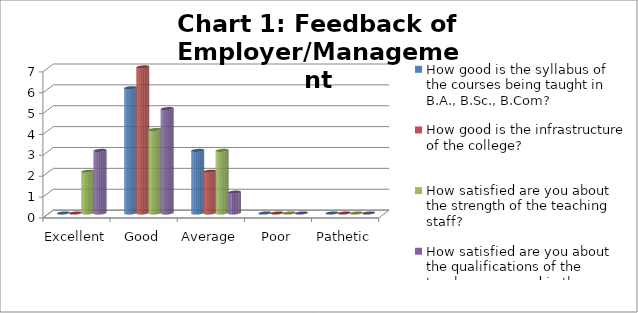
| Category | How good is the syllabus of the courses being taught in B.A., B.Sc., B.Com? | How good is the infrastructure of the college? | How satisfied are you about the strength of the teaching staff? | How satisfied are you about the qualifications of the teachers engaged in the college? |
|---|---|---|---|---|
| Excellent | 0 | 0 | 2 | 3 |
| Good | 6 | 7 | 4 | 5 |
| Average | 3 | 2 | 3 | 1 |
| Poor | 0 | 0 | 0 | 0 |
| Pathetic | 0 | 0 | 0 | 0 |